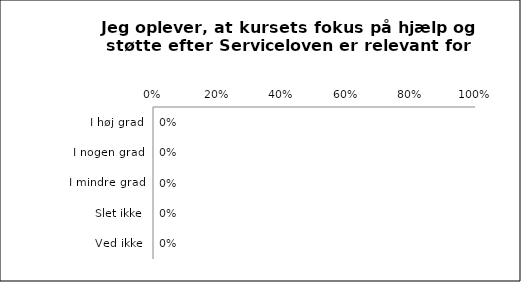
| Category | Kursets fokus på hjælp og støtte efter serviceloven er relevant for mig |
|---|---|
| I høj grad | 0 |
| I nogen grad | 0 |
| I mindre grad | 0 |
| Slet ikke | 0 |
| Ved ikke | 0 |